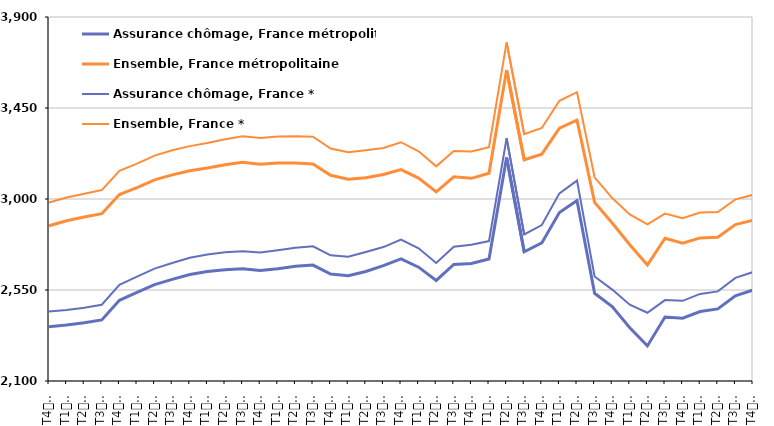
| Category | Assurance chômage, France métropolitaine | Ensemble, France métropolitaine | Assurance chômage, France * | Ensemble, France * |
|---|---|---|---|---|
| T4
2013 | 2368 | 2867.5 | 2444 | 2982.8 |
| T1
2014 | 2376.6 | 2892.6 | 2451.1 | 3007.5 |
| T2
2014 | 2388.1 | 2911.3 | 2462 | 3025.7 |
| T3
2014 | 2401.9 | 2927.3 | 2477 | 3044.2 |
| T4
2014 | 2499 | 3021.9 | 2575.9 | 3139.2 |
| T1
2015 | 2537.9 | 3056.1 | 2616.1 | 3174.8 |
| T2
2015 | 2576.4 | 3094.9 | 2655.6 | 3214.4 |
| T3
2015 | 2602.7 | 3119.5 | 2683.2 | 3240.7 |
| T4
2015 | 2626.7 | 3139.4 | 2709 | 3261.5 |
| T1
2016 | 2641.9 | 3153.4 | 2726 | 3277.2 |
| T2
2016 | 2650.6 | 3169.4 | 2736.2 | 3295.6 |
| T3
2016 | 2655.1 | 3182.1 | 2741.6 | 3310.2 |
| T4
2016 | 2646.4 | 3172.1 | 2735.2 | 3301.1 |
| T1
2017 | 2655.2 | 3178 | 2746.3 | 3309.6 |
| T2
2017 | 2667.2 | 3177.8 | 2759.1 | 3310.7 |
| T3
2017 | 2673.4 | 3173.6 | 2765.9 | 3307.8 |
| T4
2017 | 2629.3 | 3117.5 | 2721.7 | 3249.7 |
| T1
2018 | 2620.8 | 3097.4 | 2714.4 | 3230.9 |
| T2
2018 | 2641.7 | 3105.1 | 2738.2 | 3241.4 |
| T3
2018 | 2670.9 | 3121.1 | 2762.3 | 3252.6 |
| T4
2018 | 2703.6 | 3145.7 | 2799.2 | 3280.7 |
| T1
2019 | 2662.9 | 3103.7 | 2756.2 | 3235.7 |
| T2
2019 | 2597.1 | 3035.5 | 2683.9 | 3161.5 |
| T3
2019 | 2676.7 | 3109.4 | 2764.1 | 3236.8 |
| T4
2019 | 2680.9 | 3102.2 | 2773.9 | 3234.5 |
| T1
2020 | 2703.6 | 3127.5 | 2792 | 3255.8 |
| T2
2020 | 3204.8 | 3637.8 | 3300.5 | 3774.3 |
| T3
2020 | 2738.7 | 3193.9 | 2824.7 | 3320.8 |
| T4
2020 | 2782.9 | 3221.9 | 2871.3 | 3351.2 |
| T1
2021 | 2933.4 | 3350.1 | 3028.1 | 3485.7 |
| T2
2021 | 2992.4 | 3389.5 | 3091.1 | 3528.2 |
| T3
2021 | 2533.6 | 2983.4 | 2616.7 | 3107.3 |
| T4
2021 | 2468.1 | 2881.5 | 2552.1 | 3004.6 |
| T1
2022 | 2363.1 | 2773.9 | 2477.2 | 2923.9 |
| T2
2022 | 2273.5 | 2673.4 | 2437.6 | 2874.8 |
| T3
2022 | 2416.3 | 2805.7 | 2500.2 | 2928.1 |
| T4
2022 | 2410.9 | 2781.5 | 2496.5 | 2904.8 |
| T1
2023 | 2443.6 | 2807.7 | 2530.7 | 2933.2 |
| T2
2023 | 2456.7 | 2811.1 | 2543.1 | 2935.6 |
| T3
2023 | 2521.5 | 2873.2 | 2609.7 | 2998 |
| T4
2023 | 2549.4 | 2894.6 | 2639.1 | 3020.4 |